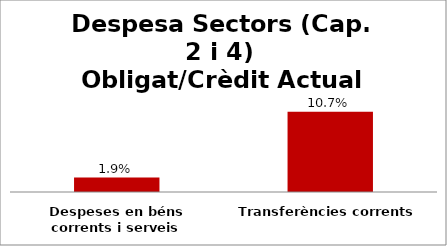
| Category | Series 0 |
|---|---|
| Despeses en béns corrents i serveis | 0.019 |
| Transferències corrents | 0.107 |